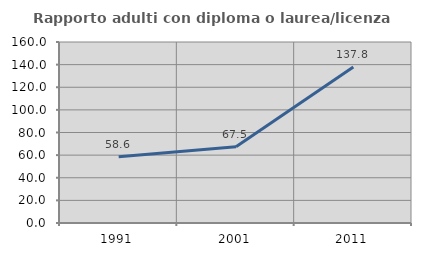
| Category | Rapporto adulti con diploma o laurea/licenza media  |
|---|---|
| 1991.0 | 58.571 |
| 2001.0 | 67.48 |
| 2011.0 | 137.799 |